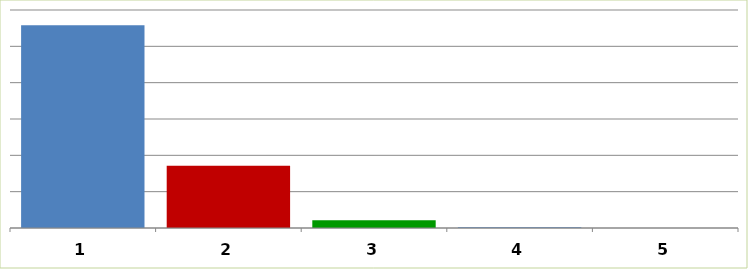
| Category | Series 0 |
|---|---|
| 0 | 27908034 |
| 1 | 8559000 |
| 2 | 1054192 |
| 3 | 97105 |
| 4 | 0 |